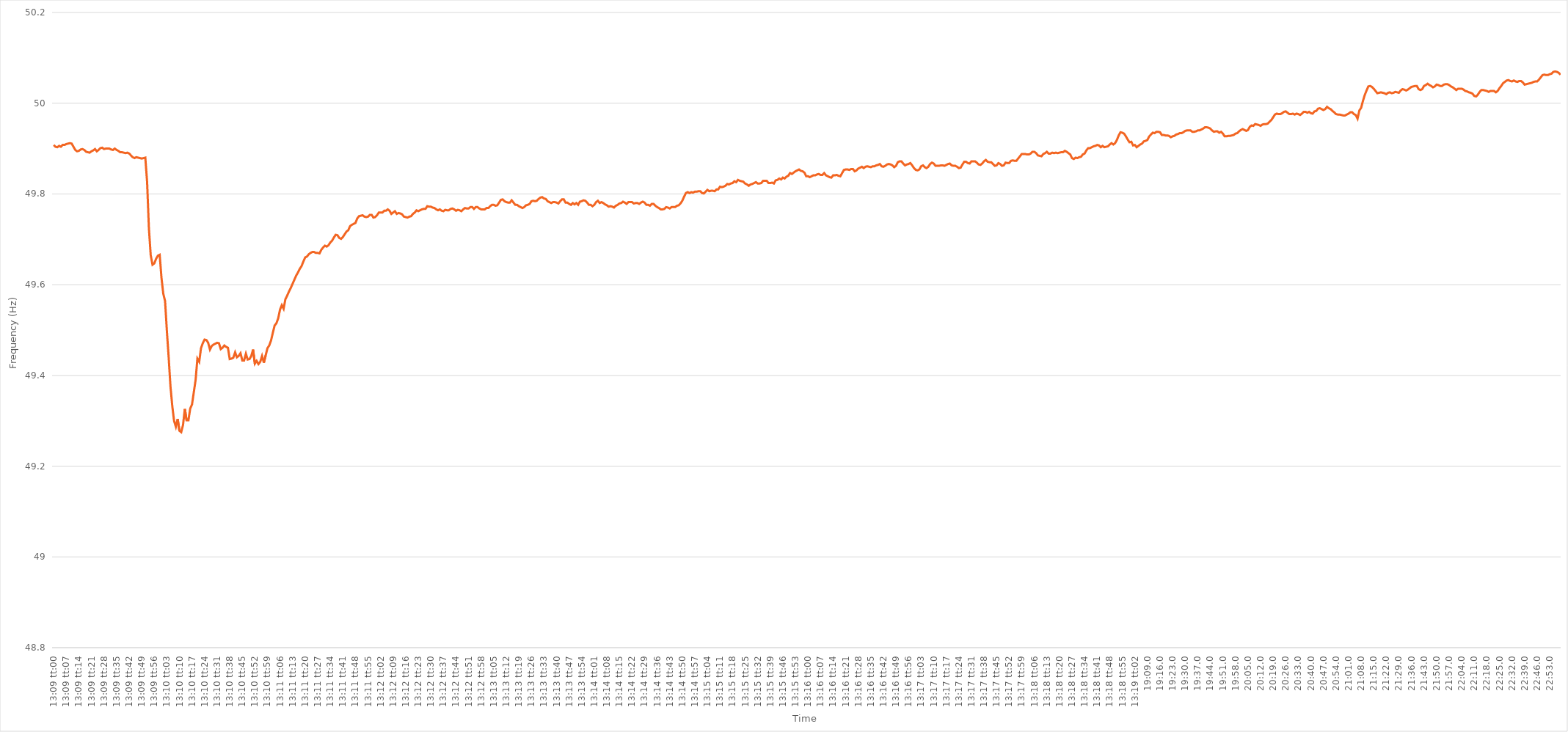
| Category | Series 0 |
|---|---|
| 0.5479166666666667 | 49.908 |
| 0.5479282407407408 | 49.904 |
| 0.5479398148148148 | 49.903 |
| 0.5479513888888888 | 49.906 |
| 0.547962962962963 | 49.904 |
| 0.547974537037037 | 49.908 |
| 0.5479861111111112 | 49.908 |
| 0.5479976851851852 | 49.91 |
| 0.5480092592592593 | 49.911 |
| 0.5480208333333333 | 49.912 |
| 0.5480324074074074 | 49.911 |
| 0.5480439814814815 | 49.904 |
| 0.5480555555555555 | 49.897 |
| 0.5480671296296297 | 49.894 |
| 0.5480787037037037 | 49.895 |
| 0.5480902777777777 | 49.898 |
| 0.5481018518518518 | 49.899 |
| 0.5481134259259259 | 49.897 |
| 0.548125 | 49.893 |
| 0.5481365740740741 | 49.892 |
| 0.5481481481481482 | 49.891 |
| 0.5481597222222222 | 49.894 |
| 0.5481712962962962 | 49.896 |
| 0.5481828703703704 | 49.899 |
| 0.5481944444444444 | 49.894 |
| 0.5482060185185186 | 49.897 |
| 0.5482175925925926 | 49.901 |
| 0.5482291666666667 | 49.902 |
| 0.5482407407407407 | 49.899 |
| 0.5482523148148148 | 49.9 |
| 0.5482638888888889 | 49.9 |
| 0.548275462962963 | 49.9 |
| 0.5482870370370371 | 49.898 |
| 0.5482986111111111 | 49.897 |
| 0.5483101851851852 | 49.9 |
| 0.5483217592592592 | 49.897 |
| 0.5483333333333333 | 49.895 |
| 0.5483449074074074 | 49.892 |
| 0.5483564814814815 | 49.892 |
| 0.5483680555555556 | 49.891 |
| 0.5483796296296296 | 49.89 |
| 0.5483912037037036 | 49.891 |
| 0.5484027777777778 | 49.889 |
| 0.5484143518518518 | 49.885 |
| 0.548425925925926 | 49.881 |
| 0.5484375 | 49.879 |
| 0.5484490740740741 | 49.881 |
| 0.5484606481481481 | 49.88 |
| 0.5484722222222222 | 49.879 |
| 0.5484837962962963 | 49.878 |
| 0.5484953703703704 | 49.879 |
| 0.5485069444444445 | 49.88 |
| 0.5485185185185185 | 49.826 |
| 0.5485300925925926 | 49.724 |
| 0.5485416666666666 | 49.665 |
| 0.5485532407407407 | 49.644 |
| 0.5485648148148148 | 49.647 |
| 0.5485763888888889 | 49.657 |
| 0.548587962962963 | 49.664 |
| 0.548599537037037 | 49.666 |
| 0.548611111111111 | 49.615 |
| 0.5486226851851852 | 49.58 |
| 0.5486342592592592 | 49.564 |
| 0.5486458333333334 | 49.498 |
| 0.5486574074074074 | 49.44 |
| 0.5486689814814815 | 49.376 |
| 0.5486805555555555 | 49.333 |
| 0.5486921296296297 | 49.3 |
| 0.5487037037037037 | 49.287 |
| 0.5487152777777778 | 49.304 |
| 0.5487268518518519 | 49.278 |
| 0.5487384259259259 | 49.275 |
| 0.54875 | 49.291 |
| 0.5487615740740741 | 49.326 |
| 0.5487731481481481 | 49.301 |
| 0.5487847222222222 | 49.301 |
| 0.5487962962962963 | 49.327 |
| 0.5488078703703704 | 49.336 |
| 0.5488194444444444 | 49.363 |
| 0.5488310185185185 | 49.39 |
| 0.5488425925925926 | 49.437 |
| 0.5488541666666666 | 49.43 |
| 0.5488657407407408 | 49.46 |
| 0.5488773148148148 | 49.471 |
| 0.5488888888888889 | 49.479 |
| 0.5489004629629629 | 49.478 |
| 0.5489120370370371 | 49.472 |
| 0.5489236111111111 | 49.457 |
| 0.5489351851851852 | 49.465 |
| 0.5489467592592593 | 49.468 |
| 0.5489583333333333 | 49.47 |
| 0.5489699074074074 | 49.472 |
| 0.5489814814814815 | 49.471 |
| 0.5489930555555556 | 49.458 |
| 0.5490046296296297 | 49.461 |
| 0.5490162037037037 | 49.466 |
| 0.5490277777777778 | 49.463 |
| 0.5490393518518518 | 49.461 |
| 0.5490509259259259 | 49.436 |
| 0.5490625 | 49.437 |
| 0.549074074074074 | 49.439 |
| 0.5490856481481482 | 49.451 |
| 0.5490972222222222 | 49.44 |
| 0.5491087962962963 | 49.443 |
| 0.5491203703703703 | 49.449 |
| 0.5491319444444445 | 49.433 |
| 0.5491435185185185 | 49.433 |
| 0.5491550925925927 | 49.448 |
| 0.5491666666666667 | 49.435 |
| 0.5491782407407407 | 49.436 |
| 0.5491898148148148 | 49.443 |
| 0.5492013888888889 | 49.457 |
| 0.549212962962963 | 49.426 |
| 0.5492245370370371 | 49.432 |
| 0.5492361111111111 | 49.425 |
| 0.5492476851851852 | 49.43 |
| 0.5492592592592592 | 49.443 |
| 0.5492708333333333 | 49.428 |
| 0.5492824074074074 | 49.444 |
| 0.5492939814814815 | 49.46 |
| 0.5493055555555556 | 49.466 |
| 0.5493171296296296 | 49.477 |
| 0.5493287037037037 | 49.494 |
| 0.5493402777777777 | 49.51 |
| 0.5493518518518519 | 49.515 |
| 0.5493634259259259 | 49.526 |
| 0.5493750000000001 | 49.545 |
| 0.5493865740740741 | 49.555 |
| 0.5493981481481481 | 49.547 |
| 0.5494097222222222 | 49.568 |
| 0.5494212962962963 | 49.576 |
| 0.5494328703703704 | 49.585 |
| 0.5494444444444445 | 49.593 |
| 0.5494560185185186 | 49.602 |
| 0.5494675925925926 | 49.611 |
| 0.5494791666666666 | 49.62 |
| 0.5494907407407407 | 49.627 |
| 0.5495023148148148 | 49.635 |
| 0.5495138888888889 | 49.641 |
| 0.549525462962963 | 49.651 |
| 0.549537037037037 | 49.66 |
| 0.5495486111111111 | 49.662 |
| 0.5495601851851851 | 49.667 |
| 0.5495717592592593 | 49.67 |
| 0.5495833333333333 | 49.672 |
| 0.5495949074074075 | 49.672 |
| 0.5496064814814815 | 49.67 |
| 0.5496180555555555 | 49.67 |
| 0.5496296296296296 | 49.669 |
| 0.5496412037037037 | 49.677 |
| 0.5496527777777778 | 49.682 |
| 0.5496643518518519 | 49.686 |
| 0.549675925925926 | 49.684 |
| 0.5496875 | 49.687 |
| 0.549699074074074 | 49.693 |
| 0.5497106481481482 | 49.697 |
| 0.5497222222222222 | 49.704 |
| 0.5497337962962963 | 49.71 |
| 0.5497453703703704 | 49.709 |
| 0.5497569444444445 | 49.703 |
| 0.5497685185185185 | 49.701 |
| 0.5497800925925925 | 49.705 |
| 0.5497916666666667 | 49.711 |
| 0.5498032407407407 | 49.717 |
| 0.5498148148148149 | 49.72 |
| 0.5498263888888889 | 49.729 |
| 0.549837962962963 | 49.732 |
| 0.549849537037037 | 49.734 |
| 0.5498611111111111 | 49.736 |
| 0.5498726851851852 | 49.746 |
| 0.5498842592592593 | 49.751 |
| 0.5498958333333334 | 49.752 |
| 0.5499074074074074 | 49.753 |
| 0.5499189814814814 | 49.75 |
| 0.5499305555555556 | 49.749 |
| 0.5499421296296296 | 49.75 |
| 0.5499537037037037 | 49.754 |
| 0.5499652777777778 | 49.754 |
| 0.5499768518518519 | 49.748 |
| 0.5499884259259259 | 49.749 |
| 0.5499999999999999 | 49.753 |
| 0.5500115740740741 | 49.759 |
| 0.5500231481481481 | 49.759 |
| 0.5500347222222223 | 49.759 |
| 0.5500462962962963 | 49.763 |
| 0.5500578703703703 | 49.763 |
| 0.5500694444444444 | 49.766 |
| 0.5500810185185185 | 49.763 |
| 0.5500925925925926 | 49.756 |
| 0.5501041666666667 | 49.759 |
| 0.5501157407407408 | 49.762 |
| 0.5501273148148148 | 49.756 |
| 0.5501388888888888 | 49.758 |
| 0.550150462962963 | 49.757 |
| 0.550162037037037 | 49.755 |
| 0.5501736111111112 | 49.75 |
| 0.5501851851851852 | 49.749 |
| 0.5501967592592593 | 49.748 |
| 0.5502083333333333 | 49.75 |
| 0.5502199074074073 | 49.751 |
| 0.5502314814814815 | 49.756 |
| 0.5502430555555555 | 49.759 |
| 0.5502546296296297 | 49.764 |
| 0.5502662037037037 | 49.762 |
| 0.5502777777777778 | 49.764 |
| 0.5502893518518518 | 49.766 |
| 0.5503009259259259 | 49.767 |
| 0.5503125 | 49.767 |
| 0.5503240740740741 | 49.773 |
| 0.5503356481481482 | 49.772 |
| 0.5503472222222222 | 49.772 |
| 0.5503587962962962 | 49.77 |
| 0.5503703703703704 | 49.769 |
| 0.5503819444444444 | 49.766 |
| 0.5503935185185186 | 49.764 |
| 0.5504050925925926 | 49.766 |
| 0.5504166666666667 | 49.763 |
| 0.5504282407407407 | 49.762 |
| 0.5504398148148147 | 49.765 |
| 0.5504513888888889 | 49.764 |
| 0.5504629629629629 | 49.764 |
| 0.5504745370370371 | 49.767 |
| 0.5504861111111111 | 49.768 |
| 0.5504976851851852 | 49.766 |
| 0.5505092592592592 | 49.763 |
| 0.5505208333333333 | 49.765 |
| 0.5505324074074074 | 49.764 |
| 0.5505439814814815 | 49.762 |
| 0.5505555555555556 | 49.766 |
| 0.5505671296296296 | 49.769 |
| 0.5505787037037037 | 49.768 |
| 0.5505902777777778 | 49.768 |
| 0.5506018518518518 | 49.771 |
| 0.550613425925926 | 49.771 |
| 0.550625 | 49.767 |
| 0.5506365740740741 | 49.771 |
| 0.5506481481481481 | 49.771 |
| 0.5506597222222221 | 49.768 |
| 0.5506712962962963 | 49.766 |
| 0.5506828703703703 | 49.766 |
| 0.5506944444444445 | 49.766 |
| 0.5507060185185185 | 49.769 |
| 0.5507175925925926 | 49.769 |
| 0.5507291666666666 | 49.773 |
| 0.5507407407407408 | 49.776 |
| 0.5507523148148148 | 49.776 |
| 0.5507638888888889 | 49.774 |
| 0.550775462962963 | 49.775 |
| 0.550787037037037 | 49.781 |
| 0.5507986111111111 | 49.787 |
| 0.5508101851851852 | 49.788 |
| 0.5508217592592592 | 49.784 |
| 0.5508333333333334 | 49.782 |
| 0.5508449074074074 | 49.781 |
| 0.5508564814814815 | 49.781 |
| 0.5508680555555555 | 49.786 |
| 0.5508796296296297 | 49.781 |
| 0.5508912037037037 | 49.776 |
| 0.5509027777777779 | 49.776 |
| 0.5509143518518519 | 49.773 |
| 0.5509259259259259 | 49.771 |
| 0.5509375 | 49.769 |
| 0.550949074074074 | 49.771 |
| 0.5509606481481482 | 49.775 |
| 0.5509722222222222 | 49.776 |
| 0.5509837962962963 | 49.778 |
| 0.5509953703703704 | 49.784 |
| 0.5510069444444444 | 49.785 |
| 0.5510185185185185 | 49.784 |
| 0.5510300925925926 | 49.785 |
| 0.5510416666666667 | 49.789 |
| 0.5510532407407408 | 49.792 |
| 0.5510648148148148 | 49.793 |
| 0.5510763888888889 | 49.79 |
| 0.5510879629629629 | 49.789 |
| 0.5510995370370371 | 49.784 |
| 0.5511111111111111 | 49.782 |
| 0.5511226851851853 | 49.78 |
| 0.5511342592592593 | 49.782 |
| 0.5511458333333333 | 49.782 |
| 0.5511574074074074 | 49.781 |
| 0.5511689814814814 | 49.779 |
| 0.5511805555555556 | 49.784 |
| 0.5511921296296296 | 49.788 |
| 0.5512037037037038 | 49.788 |
| 0.5512152777777778 | 49.781 |
| 0.5512268518518518 | 49.781 |
| 0.5512384259259259 | 49.778 |
| 0.55125 | 49.776 |
| 0.5512615740740741 | 49.78 |
| 0.5512731481481482 | 49.777 |
| 0.5512847222222222 | 49.78 |
| 0.5512962962962963 | 49.776 |
| 0.5513078703703703 | 49.783 |
| 0.5513194444444445 | 49.784 |
| 0.5513310185185185 | 49.786 |
| 0.5513425925925927 | 49.785 |
| 0.5513541666666667 | 49.781 |
| 0.5513657407407407 | 49.776 |
| 0.5513773148148148 | 49.776 |
| 0.5513888888888888 | 49.773 |
| 0.551400462962963 | 49.776 |
| 0.551412037037037 | 49.782 |
| 0.5514236111111112 | 49.785 |
| 0.5514351851851852 | 49.78 |
| 0.5514467592592592 | 49.782 |
| 0.5514583333333333 | 49.78 |
| 0.5514699074074074 | 49.777 |
| 0.5514814814814815 | 49.775 |
| 0.5514930555555556 | 49.772 |
| 0.5515046296296297 | 49.773 |
| 0.5515162037037037 | 49.772 |
| 0.5515277777777777 | 49.77 |
| 0.5515393518518519 | 49.774 |
| 0.5515509259259259 | 49.776 |
| 0.5515625000000001 | 49.779 |
| 0.5515740740740741 | 49.78 |
| 0.5515856481481481 | 49.783 |
| 0.5515972222222222 | 49.781 |
| 0.5516087962962963 | 49.778 |
| 0.5516203703703704 | 49.782 |
| 0.5516319444444444 | 49.782 |
| 0.5516435185185186 | 49.782 |
| 0.5516550925925926 | 49.779 |
| 0.5516666666666666 | 49.78 |
| 0.5516782407407407 | 49.78 |
| 0.5516898148148148 | 49.778 |
| 0.5517013888888889 | 49.781 |
| 0.551712962962963 | 49.783 |
| 0.551724537037037 | 49.781 |
| 0.5517361111111111 | 49.776 |
| 0.5517476851851851 | 49.776 |
| 0.5517592592592593 | 49.774 |
| 0.5517708333333333 | 49.778 |
| 0.5517824074074075 | 49.778 |
| 0.5517939814814815 | 49.774 |
| 0.5518055555555555 | 49.771 |
| 0.5518171296296296 | 49.769 |
| 0.5518287037037037 | 49.766 |
| 0.5518402777777778 | 49.766 |
| 0.5518518518518518 | 49.767 |
| 0.551863425925926 | 49.771 |
| 0.551875 | 49.77 |
| 0.551886574074074 | 49.768 |
| 0.5518981481481481 | 49.771 |
| 0.5519097222222222 | 49.771 |
| 0.5519212962962963 | 49.771 |
| 0.5519328703703704 | 49.774 |
| 0.5519444444444445 | 49.775 |
| 0.5519560185185185 | 49.779 |
| 0.5519675925925925 | 49.785 |
| 0.5519791666666667 | 49.794 |
| 0.5519907407407407 | 49.802 |
| 0.5520023148148149 | 49.804 |
| 0.5520138888888889 | 49.802 |
| 0.552025462962963 | 49.804 |
| 0.552037037037037 | 49.803 |
| 0.5520486111111111 | 49.805 |
| 0.5520601851851852 | 49.805 |
| 0.5520717592592593 | 49.806 |
| 0.5520833333333334 | 49.806 |
| 0.5520949074074074 | 49.802 |
| 0.5521064814814814 | 49.801 |
| 0.5521180555555555 | 49.805 |
| 0.5521296296296296 | 49.809 |
| 0.5521412037037037 | 49.806 |
| 0.5521527777777778 | 49.807 |
| 0.5521643518518519 | 49.807 |
| 0.5521759259259259 | 49.806 |
| 0.5521874999999999 | 49.81 |
| 0.5521990740740741 | 49.81 |
| 0.5522106481481481 | 49.816 |
| 0.5522222222222223 | 49.815 |
| 0.5522337962962963 | 49.816 |
| 0.5522453703703704 | 49.818 |
| 0.5522569444444444 | 49.822 |
| 0.5522685185185185 | 49.821 |
| 0.5522800925925926 | 49.823 |
| 0.5522916666666667 | 49.824 |
| 0.5523032407407408 | 49.828 |
| 0.5523148148148148 | 49.826 |
| 0.5523263888888889 | 49.831 |
| 0.5523379629629629 | 49.829 |
| 0.552349537037037 | 49.828 |
| 0.5523611111111111 | 49.827 |
| 0.5523726851851852 | 49.823 |
| 0.5523842592592593 | 49.821 |
| 0.5523958333333333 | 49.818 |
| 0.5524074074074073 | 49.821 |
| 0.5524189814814815 | 49.822 |
| 0.5524305555555555 | 49.824 |
| 0.5524421296296297 | 49.826 |
| 0.5524537037037037 | 49.823 |
| 0.5524652777777778 | 49.823 |
| 0.5524768518518518 | 49.824 |
| 0.552488425925926 | 49.829 |
| 0.5525 | 49.829 |
| 0.5525115740740741 | 49.829 |
| 0.5525231481481482 | 49.824 |
| 0.5525347222222222 | 49.824 |
| 0.5525462962962963 | 49.825 |
| 0.5525578703703703 | 49.823 |
| 0.5525694444444444 | 49.83 |
| 0.5525810185185185 | 49.831 |
| 0.5525925925925926 | 49.834 |
| 0.5526041666666667 | 49.832 |
| 0.5526157407407407 | 49.836 |
| 0.5526273148148148 | 49.834 |
| 0.5526388888888889 | 49.838 |
| 0.5526504629629629 | 49.84 |
| 0.5526620370370371 | 49.846 |
| 0.5526736111111111 | 49.844 |
| 0.5526851851851852 | 49.847 |
| 0.5526967592592592 | 49.85 |
| 0.5527083333333334 | 49.852 |
| 0.5527199074074074 | 49.854 |
| 0.5527314814814815 | 49.851 |
| 0.5527430555555556 | 49.85 |
| 0.5527546296296296 | 49.847 |
| 0.5527662037037037 | 49.839 |
| 0.5527777777777778 | 49.839 |
| 0.5527893518518519 | 49.837 |
| 0.552800925925926 | 49.839 |
| 0.5528125 | 49.841 |
| 0.5528240740740741 | 49.841 |
| 0.5528356481481481 | 49.843 |
| 0.5528472222222222 | 49.844 |
| 0.5528587962962963 | 49.842 |
| 0.5528703703703703 | 49.842 |
| 0.5528819444444445 | 49.846 |
| 0.5528935185185185 | 49.841 |
| 0.5529050925925926 | 49.839 |
| 0.5529166666666666 | 49.837 |
| 0.5529282407407408 | 49.836 |
| 0.5529398148148148 | 49.841 |
| 0.552951388888889 | 49.841 |
| 0.552962962962963 | 49.842 |
| 0.552974537037037 | 49.84 |
| 0.5529861111111111 | 49.839 |
| 0.5529976851851852 | 49.846 |
| 0.5530092592592593 | 49.853 |
| 0.5530208333333334 | 49.854 |
| 0.5530324074074074 | 49.854 |
| 0.5530439814814815 | 49.853 |
| 0.5530555555555555 | 49.855 |
| 0.5530671296296296 | 49.855 |
| 0.5530787037037037 | 49.85 |
| 0.5530902777777778 | 49.852 |
| 0.5531018518518519 | 49.856 |
| 0.5531134259259259 | 49.858 |
| 0.553125 | 49.86 |
| 0.553136574074074 | 49.857 |
| 0.5531481481481482 | 49.86 |
| 0.5531597222222222 | 49.861 |
| 0.5531712962962964 | 49.86 |
| 0.5531828703703704 | 49.859 |
| 0.5531944444444444 | 49.861 |
| 0.5532060185185185 | 49.861 |
| 0.5532175925925926 | 49.863 |
| 0.5532291666666667 | 49.864 |
| 0.5532407407407408 | 49.866 |
| 0.5532523148148148 | 49.861 |
| 0.5532638888888889 | 49.86 |
| 0.5532754629629629 | 49.862 |
| 0.553287037037037 | 49.865 |
| 0.5532986111111111 | 49.866 |
| 0.5533101851851852 | 49.865 |
| 0.5533217592592593 | 49.863 |
| 0.5533333333333333 | 49.859 |
| 0.5533449074074074 | 49.862 |
| 0.5533564814814814 | 49.87 |
| 0.5533680555555556 | 49.872 |
| 0.5533796296296296 | 49.872 |
| 0.5533912037037038 | 49.867 |
| 0.5534027777777778 | 49.863 |
| 0.5534143518518518 | 49.865 |
| 0.5534259259259259 | 49.866 |
| 0.5534375 | 49.868 |
| 0.5534490740740741 | 49.863 |
| 0.5534606481481482 | 49.857 |
| 0.5534722222222223 | 49.853 |
| 0.5534837962962963 | 49.852 |
| 0.5534953703703703 | 49.854 |
| 0.5535069444444445 | 49.861 |
| 0.5535185185185185 | 49.863 |
| 0.5535300925925926 | 49.859 |
| 0.5535416666666667 | 49.857 |
| 0.5535532407407407 | 49.86 |
| 0.5535648148148148 | 49.866 |
| 0.5535763888888888 | 49.869 |
| 0.553587962962963 | 49.867 |
| 0.553599537037037 | 49.862 |
| 0.5536111111111112 | 49.862 |
| 0.5536226851851852 | 49.862 |
| 0.5536342592592592 | 49.863 |
| 0.5536458333333333 | 49.863 |
| 0.5536574074074074 | 49.862 |
| 0.5536689814814815 | 49.864 |
| 0.5536805555555556 | 49.866 |
| 0.5536921296296297 | 49.867 |
| 0.5537037037037037 | 49.863 |
| 0.5537152777777777 | 49.862 |
| 0.5537268518518519 | 49.862 |
| 0.5537384259259259 | 49.86 |
| 0.55375 | 49.857 |
| 0.5537615740740741 | 49.858 |
| 0.5537731481481482 | 49.865 |
| 0.5537847222222222 | 49.871 |
| 0.5537962962962962 | 49.871 |
| 0.5538078703703704 | 49.868 |
| 0.5538194444444444 | 49.867 |
| 0.5538310185185186 | 49.872 |
| 0.5538425925925926 | 49.872 |
| 0.5538541666666666 | 49.872 |
| 0.5538657407407407 | 49.869 |
| 0.5538773148148148 | 49.865 |
| 0.5538888888888889 | 49.864 |
| 0.553900462962963 | 49.867 |
| 0.5539120370370371 | 49.872 |
| 0.5539236111111111 | 49.875 |
| 0.5539351851851851 | 49.871 |
| 0.5539467592592593 | 49.87 |
| 0.5539583333333333 | 49.87 |
| 0.5539699074074074 | 49.866 |
| 0.5539814814814815 | 49.862 |
| 0.5539930555555556 | 49.863 |
| 0.5540046296296296 | 49.868 |
| 0.5540162037037036 | 49.866 |
| 0.5540277777777778 | 49.862 |
| 0.5540393518518518 | 49.863 |
| 0.554050925925926 | 49.869 |
| 0.5540625 | 49.868 |
| 0.554074074074074 | 49.868 |
| 0.5540856481481481 | 49.873 |
| 0.5540972222222222 | 49.874 |
| 0.5541087962962963 | 49.873 |
| 0.5541203703703704 | 49.873 |
| 0.5541319444444445 | 49.878 |
| 0.5541435185185185 | 49.883 |
| 0.5541550925925925 | 49.888 |
| 0.5541666666666667 | 49.888 |
| 0.5541782407407407 | 49.888 |
| 0.5541898148148149 | 49.887 |
| 0.5542013888888889 | 49.887 |
| 0.554212962962963 | 49.889 |
| 0.554224537037037 | 49.893 |
| 0.554236111111111 | 49.893 |
| 0.5542476851851852 | 49.89 |
| 0.5542592592592592 | 49.885 |
| 0.5542708333333334 | 49.884 |
| 0.5542824074074074 | 49.883 |
| 0.5542939814814815 | 49.888 |
| 0.5543055555555555 | 49.89 |
| 0.5543171296296296 | 49.893 |
| 0.5543287037037037 | 49.889 |
| 0.5543402777777778 | 49.889 |
| 0.5543518518518519 | 49.891 |
| 0.5543634259259259 | 49.89 |
| 0.554375 | 49.891 |
| 0.5543865740740741 | 49.89 |
| 0.5543981481481481 | 49.891 |
| 0.5544097222222223 | 49.892 |
| 0.5544212962962963 | 49.892 |
| 0.5544328703703704 | 49.895 |
| 0.5544444444444444 | 49.893 |
| 0.5544560185185184 | 49.89 |
| 0.5544675925925926 | 49.887 |
| 0.5544791666666666 | 49.879 |
| 0.5544907407407408 | 49.877 |
| 0.5545023148148148 | 49.88 |
| 0.5545138888888889 | 49.879 |
| 0.5545254629629629 | 49.881 |
| 0.554537037037037 | 49.882 |
| 0.5545486111111111 | 49.887 |
| 0.5545601851851852 | 49.889 |
| 0.5545717592592593 | 49.896 |
| 0.5545833333333333 | 49.901 |
| 0.5545949074074074 | 49.901 |
| 0.5546064814814815 | 49.903 |
| 0.5546180555555555 | 49.905 |
| 0.5546296296296297 | 49.906 |
| 0.5546412037037037 | 49.908 |
| 0.5546527777777778 | 49.907 |
| 0.5546643518518518 | 49.903 |
| 0.554675925925926 | 49.906 |
| 0.5546875 | 49.903 |
| 0.554699074074074 | 49.904 |
| 0.5547106481481482 | 49.905 |
| 0.5547222222222222 | 49.909 |
| 0.5547337962962963 | 49.912 |
| 0.5547453703703703 | 49.909 |
| 0.5547569444444445 | 49.912 |
| 0.5547685185185185 | 49.919 |
| 0.5547800925925926 | 49.929 |
| 0.5547916666666667 | 49.936 |
| 0.5548032407407407 | 49.935 |
| 0.5548148148148148 | 49.933 |
| 0.5548263888888889 | 49.927 |
| 0.554837962962963 | 49.92 |
| 0.5548495370370371 | 49.914 |
| 0.5548611111111111 | 49.915 |
| 0.5548726851851852 | 49.907 |
| 0.5548842592592592 | 49.908 |
| 0.5548958333333334 | 49.903 |
| 0.5549074074074074 | 49.906 |
| 0.5549189814814816 | 49.909 |
| 0.5549305555555556 | 49.911 |
| 0.5549421296296296 | 49.916 |
| 0.5549537037037037 | 49.917 |
| 0.5549652777777777 | 49.919 |
| 0.5549768518518519 | 49.927 |
| 0.5549884259259259 | 49.931 |
| 0.555 | 49.935 |
| 0.5550115740740741 | 49.934 |
| 0.5550231481481481 | 49.937 |
| 0.5550347222222222 | 49.937 |
| 0.5550462962962963 | 49.936 |
| 0.5550578703703704 | 49.93 |
| 0.5550694444444445 | 49.93 |
| 0.5550810185185185 | 49.929 |
| 0.5550925925925926 | 49.929 |
| 0.5551041666666666 | 49.928 |
| 0.5551157407407408 | 49.925 |
| 0.5551273148148148 | 49.927 |
| 0.555138888888889 | 49.928 |
| 0.555150462962963 | 49.931 |
| 0.555162037037037 | 49.932 |
| 0.5551736111111111 | 49.934 |
| 0.5551851851851851 | 49.934 |
| 0.5551967592592593 | 49.936 |
| 0.5552083333333333 | 49.939 |
| 0.5552199074074075 | 49.94 |
| 0.5552314814814815 | 49.94 |
| 0.5552430555555555 | 49.94 |
| 0.5552546296296296 | 49.937 |
| 0.5552662037037037 | 49.937 |
| 0.5552777777777778 | 49.938 |
| 0.5552893518518519 | 49.94 |
| 0.555300925925926 | 49.94 |
| 0.5553125 | 49.942 |
| 0.555324074074074 | 49.944 |
| 0.5553356481481482 | 49.947 |
| 0.5553472222222222 | 49.947 |
| 0.5553587962962964 | 49.946 |
| 0.5553703703703704 | 49.944 |
| 0.5553819444444444 | 49.94 |
| 0.5553935185185185 | 49.937 |
| 0.5554050925925926 | 49.938 |
| 0.5554166666666667 | 49.938 |
| 0.5554282407407407 | 49.935 |
| 0.5554398148148149 | 49.937 |
| 0.5554513888888889 | 49.933 |
| 0.5554629629629629 | 49.927 |
| 0.555474537037037 | 49.927 |
| 0.5554861111111111 | 49.928 |
| 0.5554976851851852 | 49.928 |
| 0.5555092592592593 | 49.929 |
| 0.5555208333333334 | 49.93 |
| 0.5555324074074074 | 49.933 |
| 0.5555439814814814 | 49.934 |
| 0.5555555555555556 | 49.938 |
| 0.5555671296296296 | 49.941 |
| 0.5555787037037038 | 49.943 |
| 0.5555902777777778 | 49.941 |
| 0.5556018518518518 | 49.939 |
| 0.5556134259259259 | 49.941 |
| 0.555625 | 49.948 |
| 0.5556365740740741 | 49.951 |
| 0.5556481481481481 | 49.95 |
| 0.5556597222222223 | 49.954 |
| 0.5556712962962963 | 49.953 |
| 0.5556828703703703 | 49.952 |
| 0.5556944444444444 | 49.95 |
| 0.5557060185185185 | 49.953 |
| 0.5557175925925926 | 49.954 |
| 0.5557291666666667 | 49.954 |
| 0.5557407407407408 | 49.955 |
| 0.5557523148148148 | 49.959 |
| 0.5557638888888888 | 49.963 |
| 0.555775462962963 | 49.969 |
| 0.555787037037037 | 49.975 |
| 0.5557986111111112 | 49.977 |
| 0.5558101851851852 | 49.976 |
| 0.5558217592592593 | 49.976 |
| 0.5558333333333333 | 49.978 |
| 0.5558449074074074 | 49.981 |
| 0.5558564814814815 | 49.982 |
| 0.5558680555555555 | 49.979 |
| 0.5558796296296297 | 49.976 |
| 0.5558912037037037 | 49.976 |
| 0.5559027777777777 | 49.977 |
| 0.5559143518518518 | 49.975 |
| 0.5559259259259259 | 49.977 |
| 0.5559375 | 49.976 |
| 0.5559490740740741 | 49.974 |
| 0.5559606481481482 | 49.977 |
| 0.5559722222222222 | 49.981 |
| 0.5559837962962962 | 49.981 |
| 0.5559953703703704 | 49.979 |
| 0.5560069444444444 | 49.981 |
| 0.5560185185185186 | 49.978 |
| 0.5560300925925926 | 49.977 |
| 0.5560416666666667 | 49.982 |
| 0.5560532407407407 | 49.983 |
| 0.5560648148148148 | 49.988 |
| 0.5560763888888889 | 49.989 |
| 0.556087962962963 | 49.987 |
| 0.5560995370370371 | 49.985 |
| 0.5561111111111111 | 49.987 |
| 0.5561226851851852 | 49.992 |
| 0.5561342592592592 | 49.989 |
| 0.5561458333333333 | 49.987 |
| 0.5561574074074074 | 49.983 |
| 0.5561689814814815 | 49.98 |
| 0.5561805555555556 | 49.976 |
| 0.5561921296296296 | 49.975 |
| 0.5562037037037036 | 49.975 |
| 0.5562152777777778 | 49.974 |
| 0.5562268518518518 | 49.973 |
| 0.556238425925926 | 49.973 |
| 0.55625 | 49.975 |
| 0.5562615740740741 | 49.977 |
| 0.5562731481481481 | 49.98 |
| 0.5562847222222222 | 49.98 |
| 0.5562962962962963 | 49.976 |
| 0.5563078703703704 | 49.974 |
| 0.5563194444444445 | 49.966 |
| 0.5563310185185185 | 49.984 |
| 0.5563425925925926 | 49.99 |
| 0.5563541666666666 | 50.005 |
| 0.5563657407407407 | 50.018 |
| 0.5563773148148148 | 50.028 |
| 0.5563888888888889 | 50.037 |
| 0.556400462962963 | 50.038 |
| 0.556412037037037 | 50.036 |
| 0.556423611111111 | 50.032 |
| 0.5564351851851852 | 50.027 |
| 0.5564467592592592 | 50.022 |
| 0.5564583333333334 | 50.023 |
| 0.5564699074074074 | 50.024 |
| 0.5564814814814815 | 50.023 |
| 0.5564930555555555 | 50.022 |
| 0.5565046296296297 | 50.02 |
| 0.5565162037037037 | 50.023 |
| 0.5565277777777778 | 50.024 |
| 0.5565393518518519 | 50.022 |
| 0.5565509259259259 | 50.023 |
| 0.5565625 | 50.025 |
| 0.556574074074074 | 50.024 |
| 0.5565856481481481 | 50.023 |
| 0.5565972222222222 | 50.028 |
| 0.5566087962962963 | 50.031 |
| 0.5566203703703704 | 50.03 |
| 0.5566319444444444 | 50.028 |
| 0.5566435185185185 | 50.03 |
| 0.5566550925925926 | 50.033 |
| 0.5566666666666666 | 50.036 |
| 0.5566782407407408 | 50.037 |
| 0.5566898148148148 | 50.038 |
| 0.5567013888888889 | 50.038 |
| 0.5567129629629629 | 50.031 |
| 0.5567245370370371 | 50.029 |
| 0.5567361111111111 | 50.031 |
| 0.5567476851851852 | 50.038 |
| 0.5567592592592593 | 50.04 |
| 0.5567708333333333 | 50.043 |
| 0.5567824074074074 | 50.04 |
| 0.5567939814814815 | 50.038 |
| 0.5568055555555556 | 50.035 |
| 0.5568171296296297 | 50.037 |
| 0.5568287037037037 | 50.041 |
| 0.5568402777777778 | 50.04 |
| 0.5568518518518518 | 50.038 |
| 0.5568634259259259 | 50.038 |
| 0.556875 | 50.041 |
| 0.556886574074074 | 50.042 |
| 0.5568981481481482 | 50.042 |
| 0.5569097222222222 | 50.04 |
| 0.5569212962962963 | 50.037 |
| 0.5569328703703703 | 50.035 |
| 0.5569444444444445 | 50.032 |
| 0.5569560185185185 | 50.029 |
| 0.5569675925925927 | 50.032 |
| 0.5569791666666667 | 50.032 |
| 0.5569907407407407 | 50.032 |
| 0.5570023148148148 | 50.03 |
| 0.5570138888888889 | 50.027 |
| 0.557025462962963 | 50.026 |
| 0.5570370370370371 | 50.024 |
| 0.5570486111111111 | 50.023 |
| 0.5570601851851852 | 50.021 |
| 0.5570717592592592 | 50.016 |
| 0.5570833333333333 | 50.015 |
| 0.5570949074074074 | 50.019 |
| 0.5571064814814815 | 50.025 |
| 0.5571180555555556 | 50.029 |
| 0.5571296296296296 | 50.029 |
| 0.5571412037037037 | 50.028 |
| 0.5571527777777777 | 50.027 |
| 0.5571643518518519 | 50.025 |
| 0.5571759259259259 | 50.027 |
| 0.5571875000000001 | 50.027 |
| 0.5571990740740741 | 50.027 |
| 0.5572106481481481 | 50.024 |
| 0.5572222222222222 | 50.027 |
| 0.5572337962962963 | 50.033 |
| 0.5572453703703704 | 50.038 |
| 0.5572569444444445 | 50.044 |
| 0.5572685185185186 | 50.047 |
| 0.5572800925925926 | 50.05 |
| 0.5572916666666666 | 50.051 |
| 0.5573032407407407 | 50.049 |
| 0.5573148148148148 | 50.048 |
| 0.5573263888888889 | 50.05 |
| 0.557337962962963 | 50.048 |
| 0.557349537037037 | 50.047 |
| 0.5573611111111111 | 50.049 |
| 0.5573726851851851 | 50.049 |
| 0.5573842592592593 | 50.046 |
| 0.5573958333333333 | 50.041 |
| 0.5574074074074075 | 50.042 |
| 0.5574189814814815 | 50.043 |
| 0.5574305555555555 | 50.044 |
| 0.5574421296296296 | 50.045 |
| 0.5574537037037037 | 50.047 |
| 0.5574652777777778 | 50.048 |
| 0.5574768518518519 | 50.048 |
| 0.557488425925926 | 50.052 |
| 0.5575 | 50.057 |
| 0.557511574074074 | 50.062 |
| 0.5575231481481482 | 50.063 |
| 0.5575347222222222 | 50.062 |
| 0.5575462962962963 | 50.062 |
| 0.5575578703703704 | 50.064 |
| 0.5575694444444445 | 50.065 |
| 0.5575810185185185 | 50.069 |
| 0.5575925925925925 | 50.07 |
| 0.5576041666666667 | 50.069 |
| 0.5576157407407407 | 50.067 |
| 0.5576273148148149 | 50.063 |